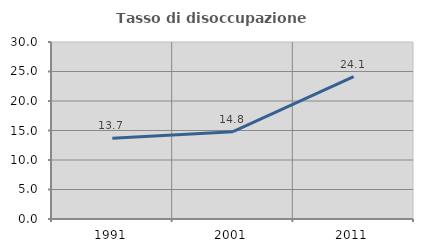
| Category | Tasso di disoccupazione giovanile  |
|---|---|
| 1991.0 | 13.676 |
| 2001.0 | 14.808 |
| 2011.0 | 24.129 |